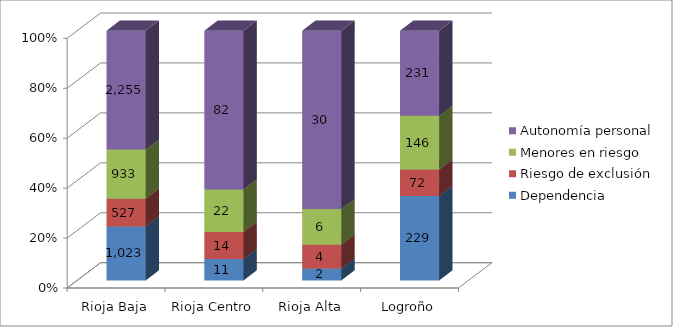
| Category | Dependencia | Riesgo de exclusión | Menores en riesgo | Autonomía personal |
|---|---|---|---|---|
| Rioja Baja | 1023 | 527 | 933 | 2255 |
| Rioja Centro | 11 | 14 | 22 | 82 |
| Rioja Alta | 2 | 4 | 6 | 30 |
| Logroño | 229 | 72 | 146 | 231 |